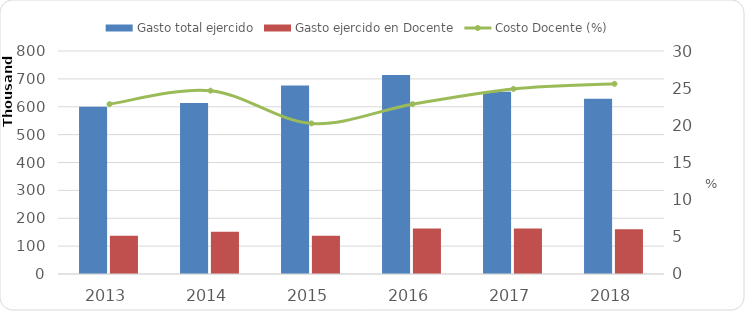
| Category | Gasto total ejercido | Gasto ejercido en Docente |
|---|---|---|
| 2013 | 600163.1 | 137147.673 |
| 2014 | 613052.1 | 151173.245 |
| 2015 | 676403.338 | 137024.068 |
| 2016 | 713725.8 | 163056.983 |
| 2017 | 653670.792 | 162783.767 |
| 2018 | 628799.563 | 160863.176 |